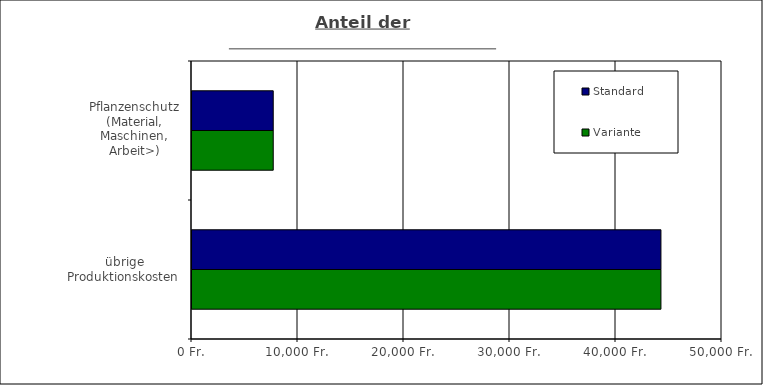
| Category | Standard | Variante  |
|---|---|---|
| Pflanzenschutz (Material, Maschinen, Arbeit>) | 7663.853 | 7663.853 |
| übrige Produktionskosten | 44240.797 | 44240.826 |